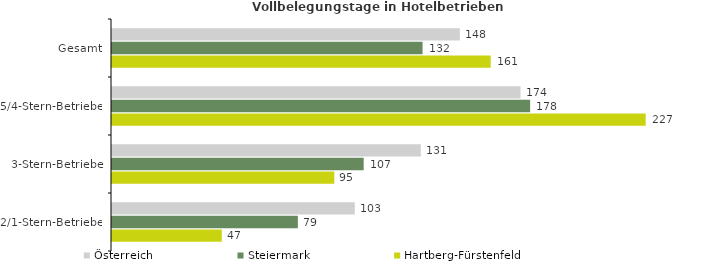
| Category | Österreich | Steiermark | Hartberg-Fürstenfeld |
|---|---|---|---|
| Gesamt | 147.876 | 132.038 | 161.017 |
| 5/4-Stern-Betriebe | 173.697 | 177.779 | 226.907 |
| 3-Stern-Betriebe | 131.294 | 107.011 | 94.523 |
| 2/1-Stern-Betriebe | 103.222 | 79.024 | 46.679 |